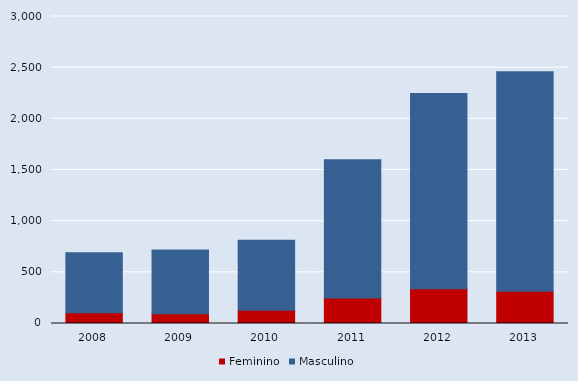
| Category | Feminino | Masculino |
|---|---|---|
| 2008.0 | 104 | 588 |
| 2009.0 | 96 | 622 |
| 2010.0 | 129 | 685 |
| 2011.0 | 249 | 1350 |
| 2012.0 | 340 | 1907 |
| 2013.0 | 315 | 2144 |